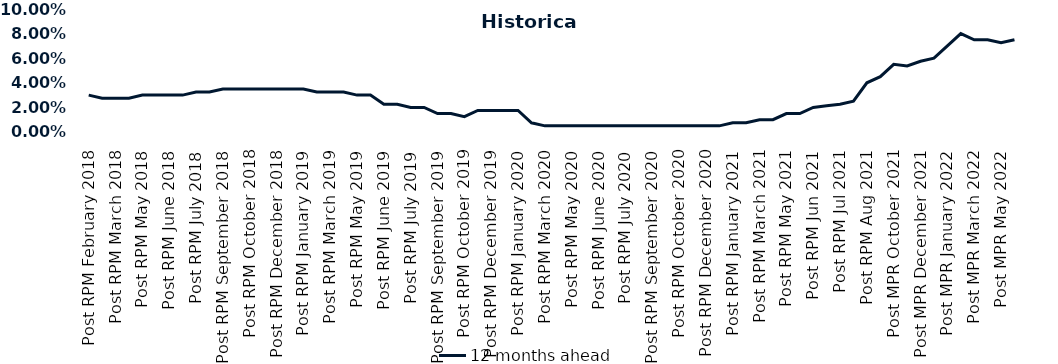
| Category | 12 months ahead |
|---|---|
| Post RPM February 2018 | 0.03 |
| Pre RPM March 2018 | 0.028 |
| Post RPM March 2018 | 0.028 |
| Pre RPM May 2018 | 0.028 |
| Post RPM May 2018 | 0.03 |
| Pre RPM June 2018 | 0.03 |
| Post RPM June 2018 | 0.03 |
| Pre RPM July 2018 | 0.03 |
| Post RPM July 2018 | 0.032 |
| Pre RPM September 2018 | 0.032 |
| Post RPM September 2018 | 0.035 |
| Pre RPM October 2018 | 0.035 |
| Post RPM October 2018 | 0.035 |
| Pre RPM December 2018 | 0.035 |
| Post RPM December 2018 | 0.035 |
| Pre RPM January 2019 | 0.035 |
| Post RPM January 2019 | 0.035 |
| Pre RPM March 2019 | 0.032 |
| Post RPM March 2019 | 0.032 |
| Pre RPM May 2019 | 0.032 |
| Post RPM May 2019 | 0.03 |
| Pre RPM June 2019 | 0.03 |
| Post RPM June 2019 | 0.022 |
| Pre RPM July 2019 | 0.022 |
| Post RPM July 2019 | 0.02 |
| Pre RPM September 2019 | 0.02 |
| Post RPM September 2019 | 0.015 |
| Pre RPM October 2019 | 0.015 |
| Post RPM October 2019 | 0.012 |
| Pre RPM December 2019 | 0.018 |
| Post RPM December 2019 | 0.018 |
| Pre RPM January 2020 | 0.018 |
| Post RPM January 2020 | 0.018 |
| Pre RPM March 2020 | 0.008 |
| Post RPM March 2020 | 0.005 |
| Pre RPM May 2020 | 0.005 |
| Post RPM May 2020 | 0.005 |
| Pre RPM June 2020 | 0.005 |
| Post RPM June 2020 | 0.005 |
| Pre RPM July 2020 | 0.005 |
| Post RPM July 2020 | 0.005 |
| Pre RPM September 2020 | 0.005 |
| Post RPM September 2020 | 0.005 |
| Pre RPM October 2020 | 0.005 |
| Post RPM October 2020 | 0.005 |
| Pre RPM December 2020 | 0.005 |
|  Post RPM December 2020 | 0.005 |
| Pre RPM January 2021 | 0.005 |
| Post RPM January 2021 | 0.008 |
|  Pre RPM March 2021 | 0.008 |
|  Post RPM March 2021 | 0.01 |
|  Pre RPM May 2021 | 0.01 |
|  Post RPM May 2021 | 0.015 |
|  Pre RPM Jun 2021 | 0.015 |
|   Post RPM Jun 2021 | 0.02 |
| Pre RPM Jul 2021 | 0.021 |
|  Post RPM Jul 2021 | 0.022 |
| Pre RPM Aug 2021 | 0.025 |
|  Post RPM Aug 2021 | 0.04 |
| Pre MPR October 2021 | 0.045 |
| Post MPR October 2021 | 0.055 |
| Pre MPR December 2021 | 0.054 |
| Post MPR December 2021 | 0.058 |
| Pre MPR January 2022 | 0.06 |
| Post MPR January 2022 | 0.07 |
| Pre MPR March 2022 | 0.08 |
| Post MPR March 2022 | 0.075 |
| Pre MPR May 2022 | 0.075 |
| Post MPR May 2022 | 0.072 |
| Pre MPR June 2022 | 0.075 |